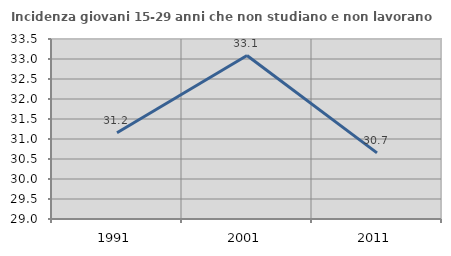
| Category | Incidenza giovani 15-29 anni che non studiano e non lavorano  |
|---|---|
| 1991.0 | 31.158 |
| 2001.0 | 33.087 |
| 2011.0 | 30.653 |